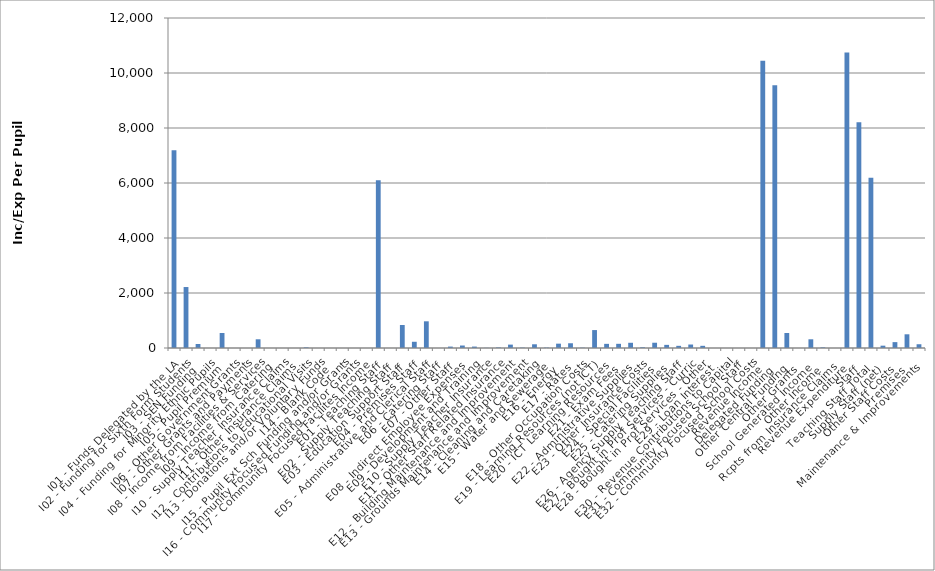
| Category | Series 0 |
|---|---|
| I01 - Funds Delegated by the LA | 7195.151 |
| I02 - Funding for Sixth Form Students | 2217.135 |
| I03 - SEN Funding | 144.989 |
| I04 - Funding for Minority Ethnic Pupils | 0 |
| I05 - Pupil Premium | 546.254 |
| I06 - Other Government Grants | 0 |
| I07 - Other Grants and Payments | 0 |
| I08 - Income from Facilities & Services | 316.943 |
| I09 - Income from Catering | 0 |
| I10 - Supply Teacher Insurance Claims | 0 |
| I11 - Other Insurance Claims | 0 |
| I12 - Contributions to Educational Visits | 22.548 |
| I13 - Donations and/or Voluntary Funds | 0 |
| I14 - Blank Code | 0 |
| I15 - Pupil Ext Sch Funding and/or Grants | 0 |
| I16 - Community Focused Funding and/or Grants | 0 |
| I17 - Community Focused Facilites Income | 0 |
| E01 - Teaching Staff | 6101.849 |
| E02 - Supply Teaching Staff | 0 |
| E03 - Education Support Staff | 836.701 |
| E04 - Premises Staff | 226.424 |
| E05 - Administrative and Clerical Staff | 970.449 |
| E06 - Catering Staff | 0 |
| E07 - Other Staff | 51.292 |
| E08 - Indirect Employee Expenses | 90.192 |
| E09 - Development and Training | 51.86 |
| E10 - Supply Teacher Insurance | 5.637 |
| E11 - Other Staff Related Insurance | 20.158 |
| E12 - Building Maintenance and Improvement | 123.191 |
| E13 - Grounds Maintenance and Improvement | 13.529 |
| E14 - Cleaning and Caretaking | 135.282 |
| E15 - Water and Sewerage | 14.515 |
| E16 - Energy | 157.835 |
| E17 - Rates | 172.492 |
| E18 - Other Occupation Costs | 11.351 |
| E19 - Learning Resources (not ICT) | 651.957 |
| E20 - ICT Learning Resources | 150.891 |
| E21 - Exam Fees | 152.198 |
| E22 - Administrative Supplies | 189.741 |
| E23 - Other Insurance Costs | 26.851 |
| E24 - Special Facilities | 191.657 |
| E25 - Catering Supplies | 114.002 |
| E26 - Agency Supply Teaching Staff | 78.918 |
| E27 - Bought in Prof Services - Curric | 126.52 |
| E28 - Bought in Prof Services - Other | 79.346 |
| E29 - Loan Interest | 0 |
| E30 - Revenue Contributions to Capital | 0 |
| E31 - Community Focused School Staff | 0 |
| E32 - Community Focused School Costs | 0 |
| Revenue Income | 10443.019 |
| Delegated Funding | 9557.275 |
| Other Central Funding | 546.254 |
| Other Grants | 0 |
| School Generated Income | 316.943 |
| Other Income | 22.548 |
| Rcpts from Insurance Claims | 0 |
| Revenue Expenditure | 10744.836 |
| Staff | 8206.487 |
| Teaching Staff Total | 6186.404 |
| Supply Staff (net) | 84.555 |
| Other Staff Costs | 213.502 |
| Premises | 498.426 |
| Maintenance & Improvements | 136.719 |